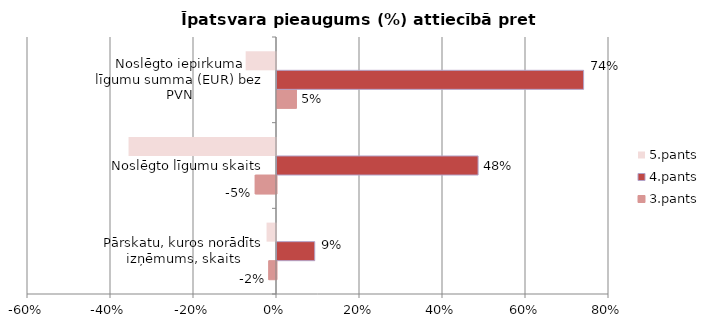
| Category | 3.pants | 4.pants | 5.pants |
|---|---|---|---|
| Pārskatu, kuros norādīts izņēmums, skaits | -0.019 | 0.091 | -0.023 |
| Noslēgto līgumu skaits | -0.051 | 0.485 | -0.355 |
| Noslēgto iepirkuma līgumu summa (EUR) bez PVN | 0.047 | 0.739 | -0.073 |